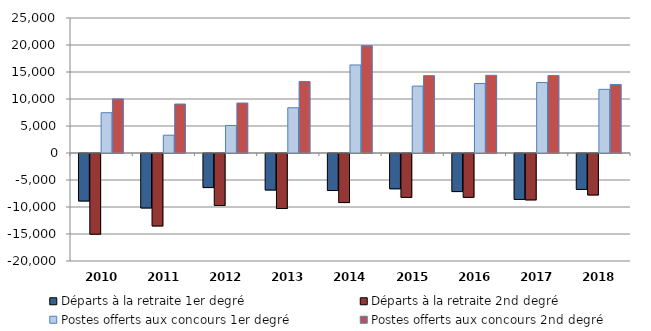
| Category | Départs à la retraite 1er degré | Départs à la retraite 2nd degré | Postes offerts aux concours 1er degré | Postes offerts aux concours 2nd degré |
|---|---|---|---|---|
| 2010.0 | -8800 | -14943 | 7462 | 10015 |
| 2011.0 | -10093 | -13422 | 3297 | 9070 |
| 2012.0 | -6308 | -9627 | 5088 | 9254 |
| 2013.0 | -6765 | -10190 | 8381 | 13235 |
| 2014.0 | -6857 | -9083 | 16303 | 19865 |
| 2015.0 | -6536 | -8130 | 12390 | 14325 |
| 2016.0 | -7049 | -8121 | 12862 | 14384 |
| 2017.0 | -8503 | -8593 | 13050 | 14349 |
| 2018.0 | -6657 | -7681 | 11789 | 12695 |